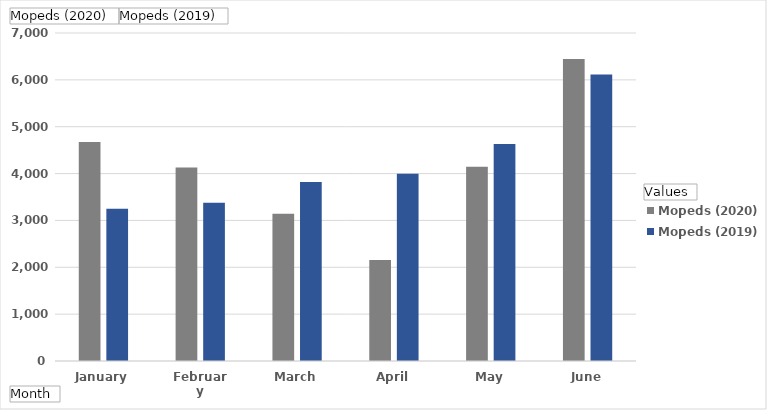
| Category | Mopeds (2020) | Mopeds (2019) |
|---|---|---|
| January | 4672 | 3247 |
| February | 4128 | 3378 |
| March | 3142 | 3819 |
| April | 2158 | 3998 |
| May | 4146 | 4629 |
| June | 6445 | 6113 |